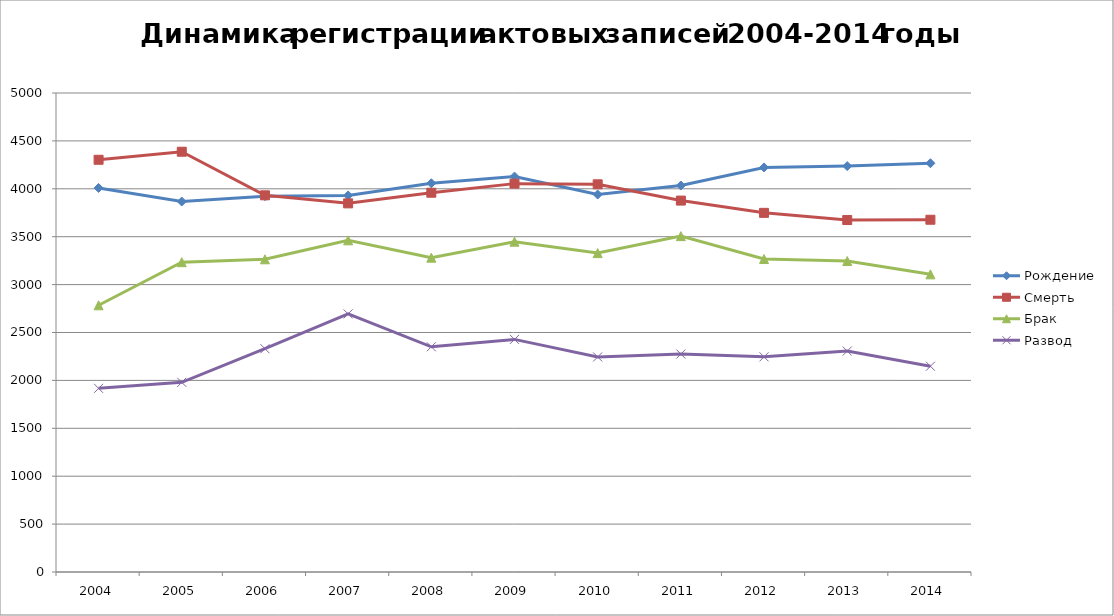
| Category | Рождение | Смерть | Брак | Развод |
|---|---|---|---|---|
| 2004.0 | 4009 | 4303 | 2784 | 1917 |
| 2005.0 | 3867 | 4387 | 3234 | 1980 |
| 2006.0 | 3923 | 3932 | 3264 | 2331 |
| 2007.0 | 3931 | 3848 | 3462 | 2694 |
| 2008.0 | 4058 | 3959 | 3281 | 2351 |
| 2009.0 | 4128 | 4054 | 3448 | 2428 |
| 2010.0 | 3940 | 4047 | 3329 | 2245 |
| 2011.0 | 4034 | 3877 | 3506 | 2275 |
| 2012.0 | 4223 | 3749 | 3267 | 2246 |
| 2013.0 | 4237 | 3674 | 3246 | 2306 |
| 2014.0 | 4267 | 3677 | 3107 | 2148 |